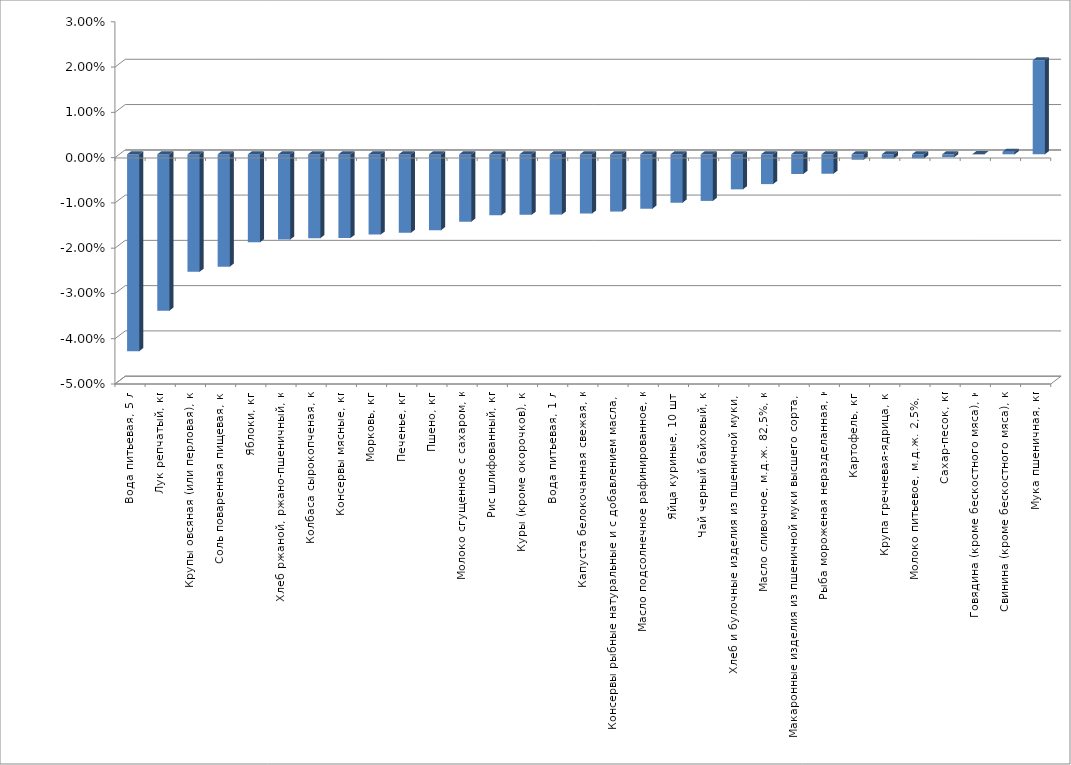
| Category | Series 0 |
|---|---|
| Вода питьевая, 5 л | -0.043 |
| Лук репчатый, кг | -0.035 |
| Крупы овсяная (или перловая), кг | -0.026 |
| Соль поваренная пищевая, кг | -0.025 |
| Яблоки, кг | -0.019 |
| Хлеб ржаной, ржано-пшеничный, кг | -0.019 |
| Колбаса сырокопченая, кг | -0.019 |
| Консервы мясные, кг | -0.018 |
| Морковь, кг | -0.018 |
| Печенье, кг | -0.017 |
| Пшено, кг | -0.017 |
| Молоко сгущенное с сахаром, кг | -0.015 |
| Рис шлифованный, кг | -0.013 |
| Куры (кроме окорочков), кг | -0.013 |
| Вода питьевая, 1 л | -0.013 |
| Капуста белокочанная свежая, кг | -0.013 |
| Консервы рыбные натуральные и с добавлением масла, кг | -0.013 |
| Масло подсолнечное рафинированное, кг | -0.012 |
| Яйца куриные, 10 шт. | -0.011 |
| Чай черный байховый, кг | -0.01 |
| Хлеб и булочные изделия из пшеничной муки, кг | -0.008 |
| Масло сливочное, м.д.ж. 82,5%, кг | -0.007 |
| Макаронные изделия из пшеничной муки высшего сорта, кг | -0.004 |
| Рыба мороженая неразделанная, кг | -0.004 |
| Картофель, кг | -0.001 |
| Крупа гречневая-ядрица, кг | -0.001 |
| Молоко питьевое, м.д.ж. 2,5%, л | -0.001 |
| Сахар-песок, кг | -0.001 |
| Говядина (кроме бескостного мяса), кг | 0 |
| Свинина (кроме бескостного мяса), кг | 0.001 |
| Мука пшеничная, кг | 0.021 |